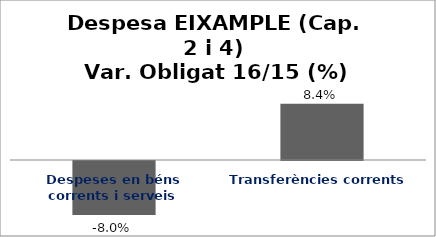
| Category | Series 0 |
|---|---|
| Despeses en béns corrents i serveis | -0.08 |
| Transferències corrents | 0.084 |